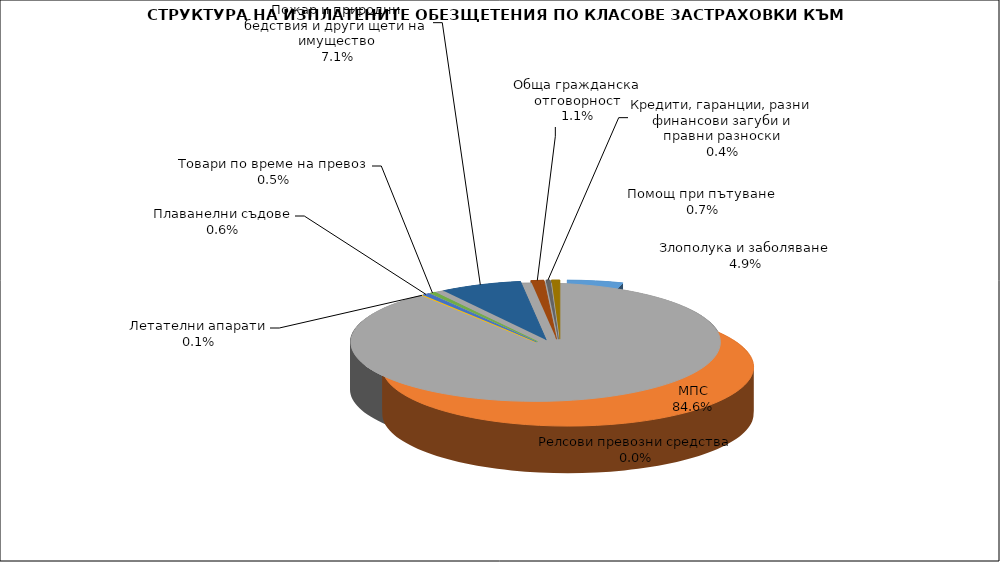
| Category | Series 0 |
|---|---|
| Злополука и заболяване | 0.049 |
| МПС | 0.846 |
| Релсови превозни средства | 0 |
| Летателни апарати | 0.001 |
| Плаванелни съдове | 0.006 |
| Товари по време на превоз | 0.005 |
| Пожар и природни бедствия и други щети на имущество | 0.071 |
| Обща гражданска отговорност | 0.011 |
| Кредити, гаранции, разни финансови загуби и правни разноски | 0.004 |
| Помощ при пътуване | 0.007 |